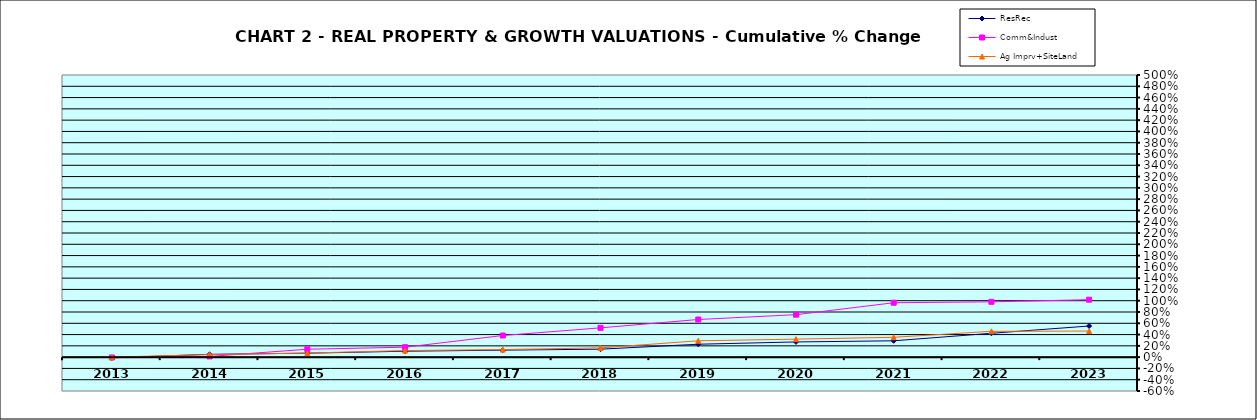
| Category | ResRec | Comm&Indust | Ag Imprv+SiteLand |
|---|---|---|---|
| 2013.0 | -0.012 | -0.006 | 0 |
| 2014.0 | 0.05 | 0.013 | 0.045 |
| 2015.0 | 0.07 | 0.14 | 0.072 |
| 2016.0 | 0.105 | 0.176 | 0.116 |
| 2017.0 | 0.124 | 0.383 | 0.134 |
| 2018.0 | 0.141 | 0.519 | 0.164 |
| 2019.0 | 0.229 | 0.667 | 0.29 |
| 2020.0 | 0.269 | 0.752 | 0.319 |
| 2021.0 | 0.289 | 0.964 | 0.352 |
| 2022.0 | 0.423 | 0.981 | 0.458 |
| 2023.0 | 0.552 | 1.018 | 0.462 |